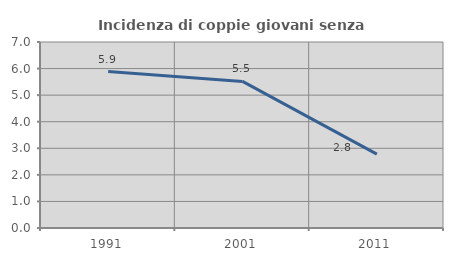
| Category | Incidenza di coppie giovani senza figli |
|---|---|
| 1991.0 | 5.887 |
| 2001.0 | 5.517 |
| 2011.0 | 2.78 |